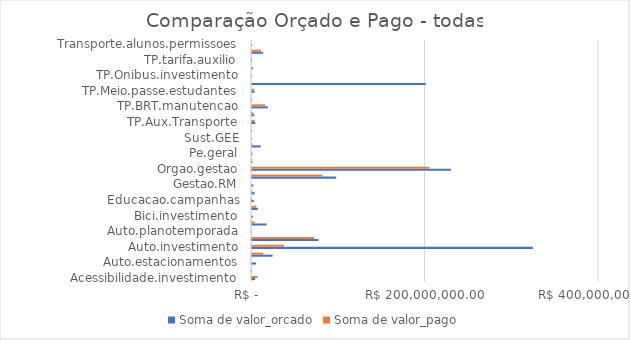
| Category | Soma de valor_orcado | Soma de valor_pago |
|---|---|---|
| Acessibilidade.investimento | 3511168 | 6276888.63 |
| Acessibilidade.projeto | 5000 | 6540.43 |
| Auto.estacionamentos | 4800940 | 0 |
| Auto.fiscalizacao | 23731049 | 13033727.82 |
| Auto.investimento | 323802255 | 36944725.86 |
| Auto.investimento+Auto.manutencao | 76739543 | 71646062.55 |
| Auto.planotemporada | 1000 | 0 |
| Auto.projetos | 16785187 | 3082511.96 |
| Bici.investimento | 1034000 | 0 |
| Dialogo.cidadao | 6750000 | 5053515.84 |
| Educacao.campanhas | 2001000 | 65000 |
| Educacao.publicidade | 3000000 | 292640 |
| Gestao.RM | 1550000 | 0 |
| Iluminacao.investimento | 97037500 | 81041707.18 |
| Orgao.gestao | 229317979 | 204558920.92 |
| Participacao.popular | 466411 | 16912.7 |
| Pe.geral | 481770 | 175485.34 |
| Pe.investimento | 9984919 | 514751.63 |
| Sust.GEE | 20000 | 0 |
| Sust.outros | 20000 | 0 |
| TP.Aux.Transporte | 3799742 | 3011164.13 |
| TP.Aux.Transporte+Orgao.gestao | 2560566 | 1431997.39 |
| TP.BRT.manutencao | 18348257 | 15250016.91 |
| TP.investimento | 1000 | 0 |
| TP.Meio.passe.estudantes | 3000000 | 2630395.03 |
| TP.Metro.investimento | 200200000 | 0 |
| TP.Onibus.investimento | 1000 | 0 |
| TP.Onibus.projeto | 1001000 | 0 |
| TP.tarifa.auxilio | 100000 | 29693.05 |
| Transporte.alunos | 12852548 | 10453789.2 |
| Transporte.alunos.permissoes | 150000 | 0 |